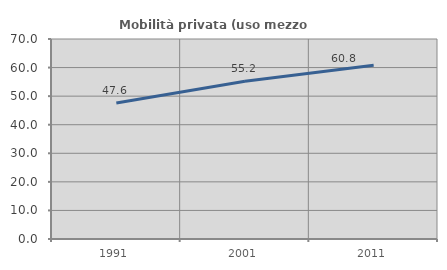
| Category | Mobilità privata (uso mezzo privato) |
|---|---|
| 1991.0 | 47.576 |
| 2001.0 | 55.182 |
| 2011.0 | 60.804 |